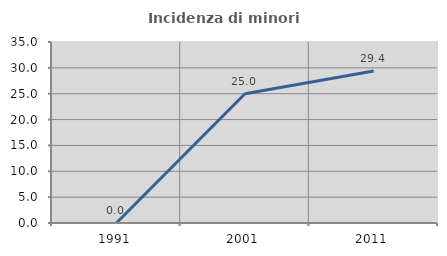
| Category | Incidenza di minori stranieri |
|---|---|
| 1991.0 | 0 |
| 2001.0 | 25 |
| 2011.0 | 29.412 |